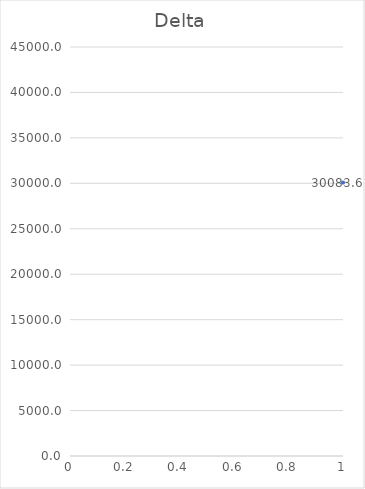
| Category | Series 0 |
|---|---|
| 0 | 30083.58 |
| 1 | 42668.01 |